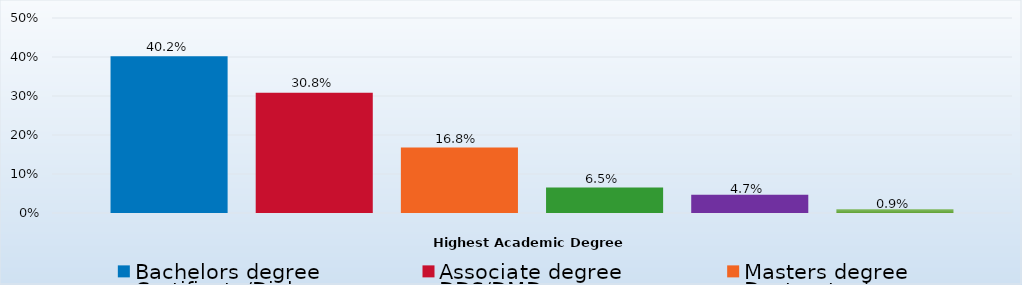
| Category | Bachelors degree | Associate degree | Masters degree | Certificate/Diploma | DDS/DMD | Doctorate degree |
|---|---|---|---|---|---|---|
| Percent | 0.402 | 0.308 | 0.168 | 0.065 | 0.047 | 0.009 |